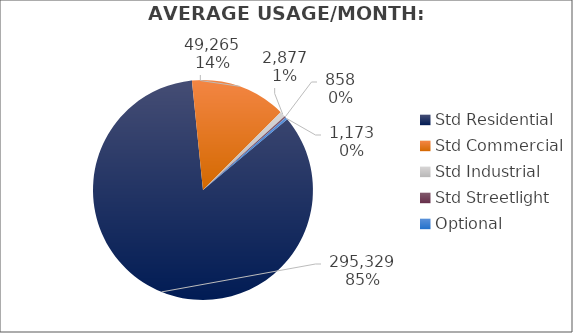
| Category | Usage |
|---|---|
| Std Residential | 295328.667 |
| Std Commercial | 49265 |
| Std Industrial | 2877 |
| Std Streetlight | 858 |
| Optional | 1173 |